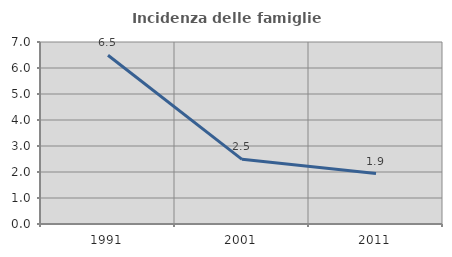
| Category | Incidenza delle famiglie numerose |
|---|---|
| 1991.0 | 6.491 |
| 2001.0 | 2.486 |
| 2011.0 | 1.939 |